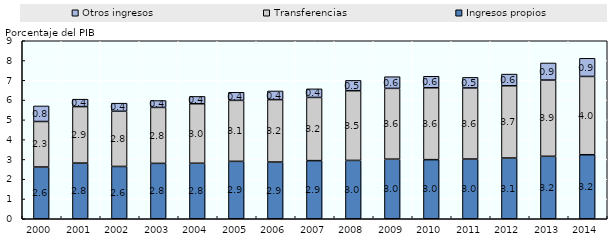
| Category | Ingresos propios | Transferencias | Otros ingresos |
|---|---|---|---|
| 2000.0 | 2.616 | 2.301 | 0.786 |
| 2001.0 | 2.815 | 2.855 | 0.376 |
| 2002.0 | 2.644 | 2.791 | 0.408 |
| 2003.0 | 2.8 | 2.828 | 0.35 |
| 2004.0 | 2.807 | 3.008 | 0.372 |
| 2005.0 | 2.903 | 3.083 | 0.41 |
| 2006.0 | 2.867 | 3.156 | 0.438 |
| 2007.0 | 2.94 | 3.195 | 0.434 |
| 2008.0 | 2.951 | 3.524 | 0.521 |
| 2009.0 | 3.013 | 3.58 | 0.59 |
| 2010.0 | 2.989 | 3.635 | 0.582 |
| 2011.0 | 3.02 | 3.594 | 0.534 |
| 2012.0 | 3.071 | 3.654 | 0.59 |
| 2013.0 | 3.158 | 3.855 | 0.864 |
| 2014.0 | 3.237 | 3.959 | 0.917 |